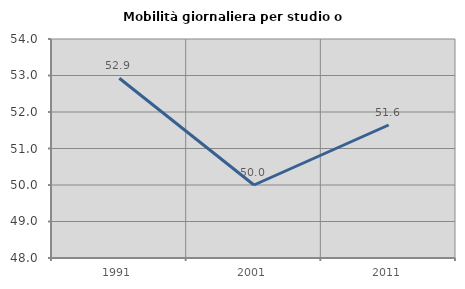
| Category | Mobilità giornaliera per studio o lavoro |
|---|---|
| 1991.0 | 52.924 |
| 2001.0 | 50 |
| 2011.0 | 51.644 |